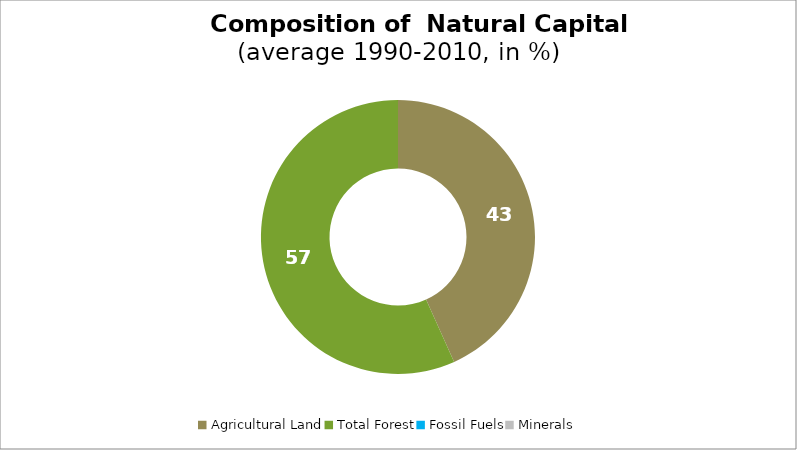
| Category | Series 0 |
|---|---|
| Agricultural Land | 43.279 |
| Total Forest | 56.721 |
| Fossil Fuels | 0 |
| Minerals | 0 |